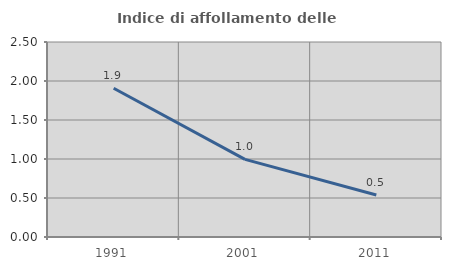
| Category | Indice di affollamento delle abitazioni  |
|---|---|
| 1991.0 | 1.907 |
| 2001.0 | 0.995 |
| 2011.0 | 0.538 |